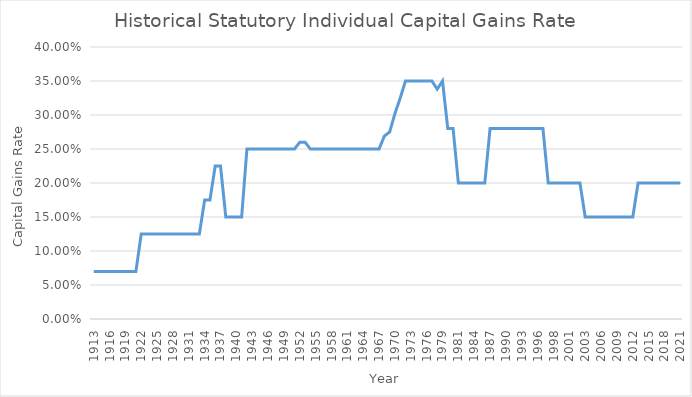
| Category | Series 0 |
|---|---|
| 1913.0 | 0.07 |
| 1914.0 | 0.07 |
| 1915.0 | 0.07 |
| 1916.0 | 0.07 |
| 1917.0 | 0.07 |
| 1918.0 | 0.07 |
| 1919.0 | 0.07 |
| 1920.0 | 0.07 |
| 1921.0 | 0.07 |
| 1922.0 | 0.125 |
| 1923.0 | 0.125 |
| 1924.0 | 0.125 |
| 1925.0 | 0.125 |
| 1926.0 | 0.125 |
| 1927.0 | 0.125 |
| 1928.0 | 0.125 |
| 1929.0 | 0.125 |
| 1930.0 | 0.125 |
| 1931.0 | 0.125 |
| 1932.0 | 0.125 |
| 1933.0 | 0.125 |
| 1934.0 | 0.175 |
| 1935.0 | 0.175 |
| 1936.0 | 0.225 |
| 1937.0 | 0.225 |
| 1938.0 | 0.15 |
| 1939.0 | 0.15 |
| 1940.0 | 0.15 |
| 1941.0 | 0.15 |
| 1942.0 | 0.25 |
| 1943.0 | 0.25 |
| 1944.0 | 0.25 |
| 1945.0 | 0.25 |
| 1946.0 | 0.25 |
| 1947.0 | 0.25 |
| 1948.0 | 0.25 |
| 1949.0 | 0.25 |
| 1950.0 | 0.25 |
| 1951.0 | 0.25 |
| 1952.0 | 0.26 |
| 1953.0 | 0.26 |
| 1954.0 | 0.25 |
| 1955.0 | 0.25 |
| 1956.0 | 0.25 |
| 1957.0 | 0.25 |
| 1958.0 | 0.25 |
| 1959.0 | 0.25 |
| 1960.0 | 0.25 |
| 1961.0 | 0.25 |
| 1962.0 | 0.25 |
| 1963.0 | 0.25 |
| 1964.0 | 0.25 |
| 1965.0 | 0.25 |
| 1966.0 | 0.25 |
| 1967.0 | 0.25 |
| 1968.0 | 0.269 |
| 1969.0 | 0.275 |
| 1970.0 | 0.302 |
| 1971.0 | 0.325 |
| 1972.0 | 0.35 |
| 1973.0 | 0.35 |
| 1974.0 | 0.35 |
| 1975.0 | 0.35 |
| 1976.0 | 0.35 |
| 1977.0 | 0.35 |
| 1978.0 | 0.338 |
| 1979.0 | 0.35 |
| 1980.0 | 0.28 |
| 1981.0 | 0.28 |
| 1981.0 | 0.2 |
| 1982.0 | 0.2 |
| 1983.0 | 0.2 |
| 1984.0 | 0.2 |
| 1985.0 | 0.2 |
| 1986.0 | 0.2 |
| 1987.0 | 0.28 |
| 1988.0 | 0.28 |
| 1989.0 | 0.28 |
| 1990.0 | 0.28 |
| 1991.0 | 0.28 |
| 1992.0 | 0.28 |
| 1993.0 | 0.28 |
| 1994.0 | 0.28 |
| 1995.0 | 0.28 |
| 1996.0 | 0.28 |
| 1997.0 | 0.28 |
| 1997.0 | 0.2 |
| 1998.0 | 0.2 |
| 1999.0 | 0.2 |
| 2000.0 | 0.2 |
| 2001.0 | 0.2 |
| 2002.0 | 0.2 |
| 2003.0 | 0.2 |
| 2003.0 | 0.15 |
| 2004.0 | 0.15 |
| 2005.0 | 0.15 |
| 2006.0 | 0.15 |
| 2007.0 | 0.15 |
| 2008.0 | 0.15 |
| 2009.0 | 0.15 |
| 2010.0 | 0.15 |
| 2011.0 | 0.15 |
| 2012.0 | 0.15 |
| 2013.0 | 0.2 |
| 2014.0 | 0.2 |
| 2015.0 | 0.2 |
| 2016.0 | 0.2 |
| 2017.0 | 0.2 |
| 2018.0 | 0.2 |
| 2019.0 | 0.2 |
| 2020.0 | 0.2 |
| 2021.0 | 0.2 |